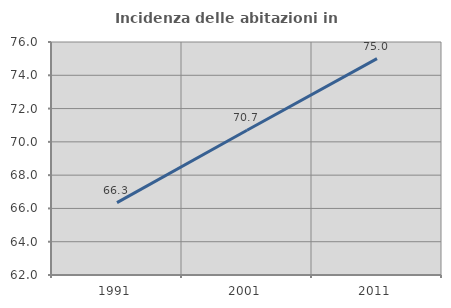
| Category | Incidenza delle abitazioni in proprietà  |
|---|---|
| 1991.0 | 66.347 |
| 2001.0 | 70.699 |
| 2011.0 | 75 |